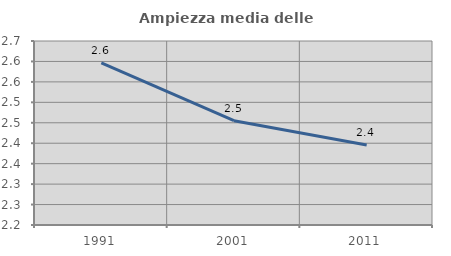
| Category | Ampiezza media delle famiglie |
|---|---|
| 1991.0 | 2.597 |
| 2001.0 | 2.455 |
| 2011.0 | 2.395 |